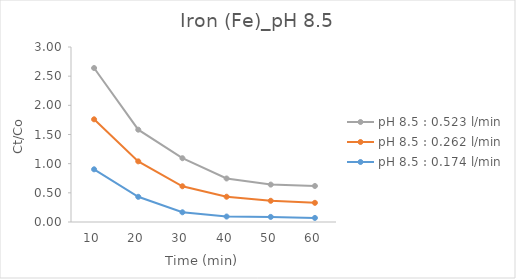
| Category | pH 8.5 : 0.174 l/min | pH 8.5 : 0.262 l/min | pH 8.5 : 0.523 l/min |
|---|---|---|---|
| 10.0 | 0.903 | 0.857 | 0.879 |
| 20.0 | 0.432 | 0.608 | 0.543 |
| 30.0 | 0.167 | 0.446 | 0.481 |
| 40.0 | 0.094 | 0.34 | 0.313 |
| 50.0 | 0.087 | 0.276 | 0.278 |
| 60.0 | 0.07 | 0.259 | 0.289 |